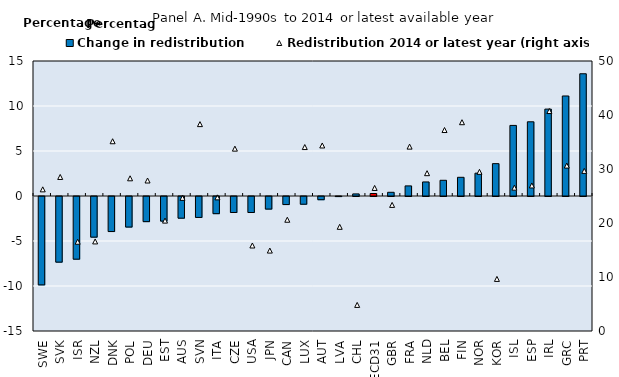
| Category | Change in redistribution |
|---|---|
| SWE | -9.82 |
| SVK | -7.294 |
| ISR | -6.965 |
| NZL | -4.517 |
| DNK | -3.893 |
| POL | -3.394 |
| DEU | -2.793 |
| EST | -2.736 |
| AUS | -2.409 |
| SVN | -2.326 |
| ITA | -1.907 |
| CZE | -1.779 |
| USA | -1.778 |
| JPN | -1.398 |
| CAN | -0.895 |
| LUX | -0.858 |
| AUT | -0.357 |
| LVA | -0.009 |
| CHL | 0.232 |
| OECD31 | 0.277 |
| GBR | 0.412 |
| FRA | 1.123 |
| NLD | 1.562 |
| BEL | 1.746 |
| FIN | 2.077 |
| NOR | 2.536 |
| KOR | 3.595 |
| ISL | 7.843 |
| ESP | 8.246 |
| IRL | 9.656 |
| GRC | 11.113 |
| PRT | 13.582 |